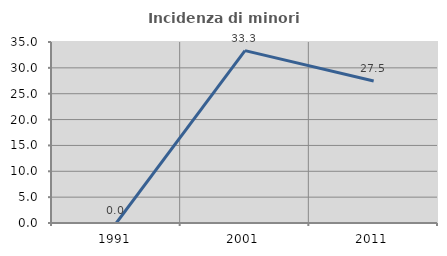
| Category | Incidenza di minori stranieri |
|---|---|
| 1991.0 | 0 |
| 2001.0 | 33.333 |
| 2011.0 | 27.451 |